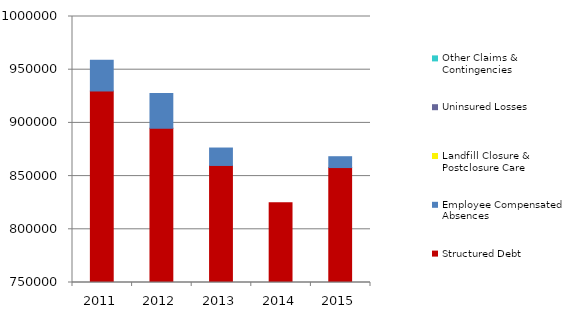
| Category |  Structured Debt  |  Employee Compensated Absences  |  Landfill Closure & Postclosure Care  |  Uninsured Losses  |  Other Claims & Contingencies  |
|---|---|---|---|---|---|
| 2011.0 | 930000 | 28872 | 0 | 0 | 0 |
| 2012.0 | 895000 | 32718 | 0 | 0 | 0 |
| 2013.0 | 860000 | 16389 | 0 | 0 | 0 |
| 2014.0 | 825000 | 0 | 0 | 0 | 0 |
| 2015.0 | 858020 | 10202 | 0 | 0 | 0 |